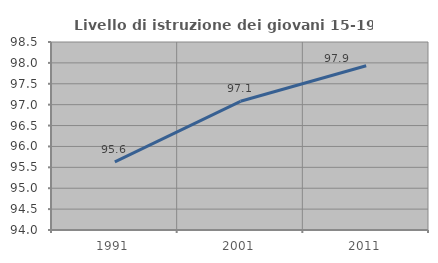
| Category | Livello di istruzione dei giovani 15-19 anni |
|---|---|
| 1991.0 | 95.628 |
| 2001.0 | 97.08 |
| 2011.0 | 97.931 |